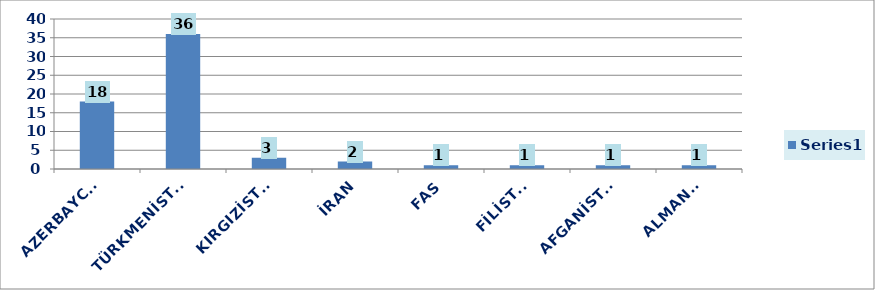
| Category | Series 0 |
|---|---|
| AZERBAYCAN | 18 |
| TÜRKMENİSTAN | 36 |
| KIRGIZİSTAN | 3 |
| İRAN | 2 |
| FAS | 1 |
| FİLİSTİN | 1 |
| AFGANİSTAN | 1 |
| ALMANYA | 1 |